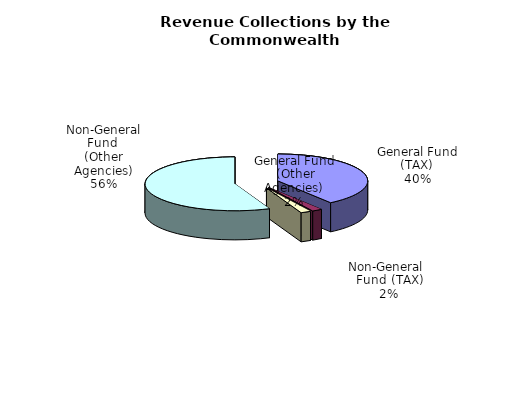
| Category | Series 0 |
|---|---|
| General Fund | 17069018000 |
| Non-General Fund | 783311000 |
| General Fund | 787553000 |
| Non-General Fund | 24021908000 |